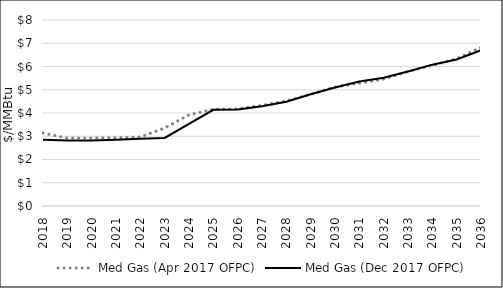
| Category | Med Gas (Apr 2017 OFPC) | Med Gas (Dec 2017 OFPC) |
|---|---|---|
| 2018.0 | 3.139 | 2.847 |
| 2019.0 | 2.92 | 2.814 |
| 2020.0 | 2.92 | 2.816 |
| 2021.0 | 2.94 | 2.852 |
| 2022.0 | 2.965 | 2.887 |
| 2023.0 | 3.354 | 2.927 |
| 2024.0 | 3.92 | 3.533 |
| 2025.0 | 4.162 | 4.138 |
| 2026.0 | 4.179 | 4.152 |
| 2027.0 | 4.329 | 4.291 |
| 2028.0 | 4.519 | 4.485 |
| 2029.0 | 4.806 | 4.804 |
| 2030.0 | 5.117 | 5.1 |
| 2031.0 | 5.284 | 5.355 |
| 2032.0 | 5.459 | 5.514 |
| 2033.0 | 5.787 | 5.785 |
| 2034.0 | 6.047 | 6.08 |
| 2035.0 | 6.339 | 6.301 |
| 2036.0 | 6.823 | 6.7 |